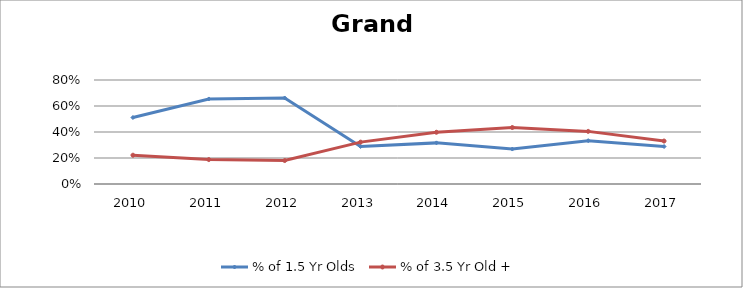
| Category | % of 1.5 Yr Olds | % of 3.5 Yr Old + |
|---|---|---|
| 2010.0 | 0.511 | 0.221 |
| 2011.0 | 0.654 | 0.188 |
| 2012.0 | 0.662 | 0.18 |
| 2013.0 | 0.289 | 0.322 |
| 2014.0 | 0.316 | 0.398 |
| 2015.0 | 0.269 | 0.434 |
| 2016.0 | 0.333 | 0.405 |
| 2017.0 | 0.288 | 0.331 |